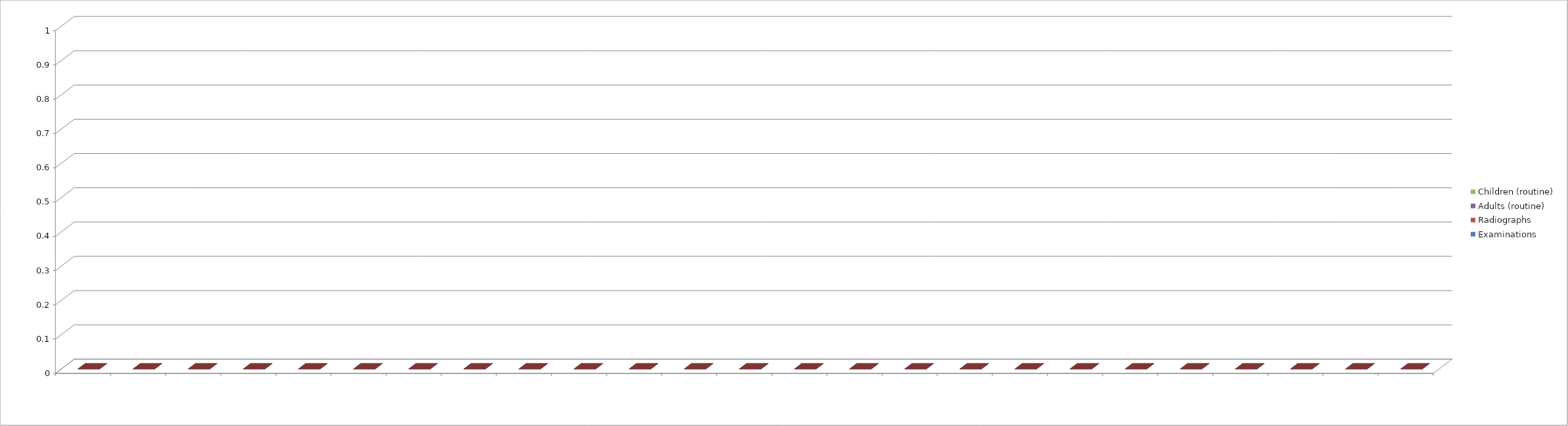
| Category | Examinations | Radiographs | Adults (routine) | Children (routine) |
|---|---|---|---|---|
| 0 | 0 | 0 | 0 | 0 |
| 1 | 0 | 0 | 0 | 0 |
| 2 | 0 | 0 | 0 | 0 |
| 3 | 0 | 0 | 0 | 0 |
| 4 | 0 | 0 | 0 | 0 |
| 5 | 0 | 0 | 0 | 0 |
| 6 | 0 | 0 | 0 | 0 |
| 7 | 0 | 0 | 0 | 0 |
| 8 | 0 | 0 | 0 | 0 |
| 9 | 0 | 0 | 0 | 0 |
| 10 | 0 | 0 | 0 | 0 |
| 11 | 0 | 0 | 0 | 0 |
| 12 | 0 | 0 | 0 | 0 |
| 13 | 0 | 0 | 0 | 0 |
| 14 | 0 | 0 | 0 | 0 |
| 15 | 0 | 0 | 0 | 0 |
| 16 | 0 | 0 | 0 | 0 |
| 17 | 0 | 0 | 0 | 0 |
| 18 | 0 | 0 | 0 | 0 |
| 19 | 0 | 0 | 0 | 0 |
| 20 | 0 | 0 | 0 | 0 |
| 21 | 0 | 0 | 0 | 0 |
| 22 | 0 | 0 | 0 | 0 |
| 23 | 0 | 0 | 0 | 0 |
| 24 | 0 | 0 | 0 | 0 |